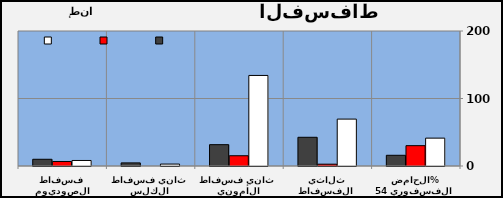
| Category | Series 2 | Series 0 | Series 1 |
|---|---|---|---|
| الحامض الفسفوري 54% | 41.277 | 30.121 | 15.874 |
| ثلاثي الفسفاط الرفيع | 69.49 | 2.7 | 42.53 |
| ثاني فسفاط الأمونيا | 134.144 | 15.191 | 31.603 |
| ثاني فسفاط الكلس | 2.85 | 0 | 4.6 |
| فسفاط الصوديوم | 8.186 | 6.678 | 9.964 |